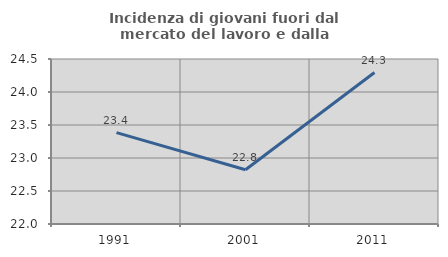
| Category | Incidenza di giovani fuori dal mercato del lavoro e dalla formazione  |
|---|---|
| 1991.0 | 23.385 |
| 2001.0 | 22.823 |
| 2011.0 | 24.295 |